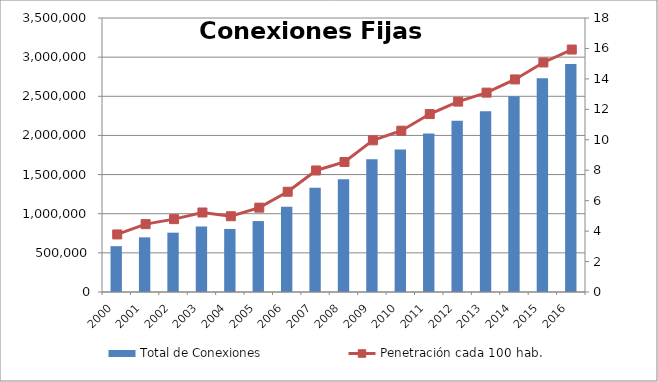
| Category | Total de Conexiones |
|---|---|
| 2000.0 | 585489 |
| 2001.0 | 698127.107 |
| 2002.0 | 757760 |
| 2003.0 | 836007 |
| 2004.0 | 805315 |
| 2005.0 | 906079 |
| 2006.0 | 1087738 |
| 2007.0 | 1331919 |
| 2008.0 | 1439009 |
| 2009.0 | 1695034 |
| 2010.0 | 1819564 |
| 2011.0 | 2025042 |
| 2012.0 | 2186173 |
| 2013.0 | 2309572 |
| 2014.0 | 2501356 |
| 2015.0 | 2729251 |
| 2016.0 | 2912133 |